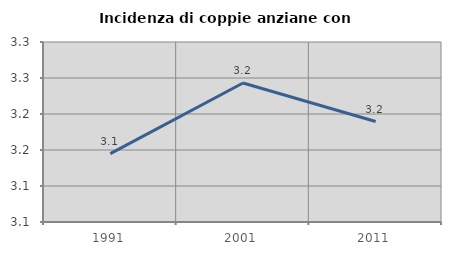
| Category | Incidenza di coppie anziane con figli |
|---|---|
| 1991.0 | 3.145 |
| 2001.0 | 3.243 |
| 2011.0 | 3.189 |